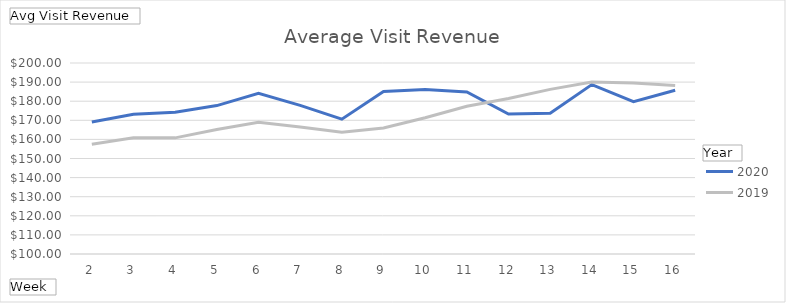
| Category | 2020 | 2019 |
|---|---|---|
| 2 | 169.101 | 157.446 |
| 3 | 173.202 | 160.883 |
| 4 | 174.231 | 160.807 |
| 5 | 177.703 | 165.17 |
| 6 | 184.136 | 168.946 |
| 7 | 177.788 | 166.46 |
| 8 | 170.572 | 163.766 |
| 9 | 185.131 | 165.928 |
| 10 | 186.153 | 171.361 |
| 11 | 184.821 | 177.324 |
| 12 | 173.277 | 181.418 |
| 13 | 173.645 | 186.182 |
| 14 | 188.673 | 190.016 |
| 15 | 179.748 | 189.579 |
| 16 | 185.71 | 188.201 |